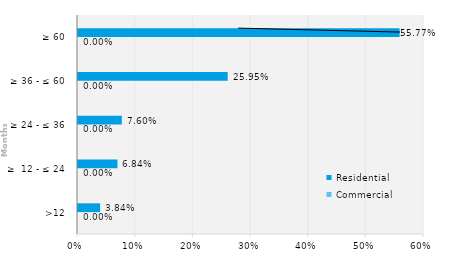
| Category | Commercial | Residential |
|---|---|---|
| >12 | 0 | 0.038 |
| ≥  12 - ≤ 24 | 0 | 0.068 |
| ≥ 24 - ≤ 36 | 0 | 0.076 |
| ≥ 36 - ≤ 60 | 0 | 0.26 |
| ≥ 60 | 0 | 0.558 |